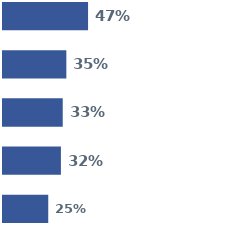
| Category | Series 0 | Series 1 | Series 2 | Series 3 | Series 4 |
|---|---|---|---|---|---|
| 0 | 0.47 | 0.35 | 0.33 | 0.32 | 0.25 |